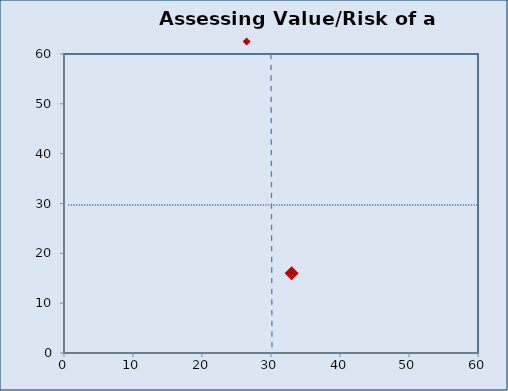
| Category | Series 0 |
|---|---|
| 33.0 | 16 |